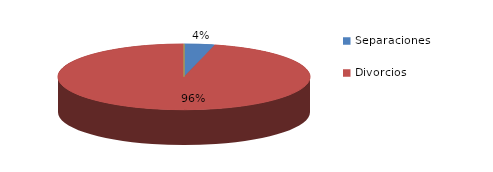
| Category | Series 0 |
|---|---|
| Separaciones | 16 |
| Divorcios | 394 |
| Ruptura Uniones de hecho | 0 |